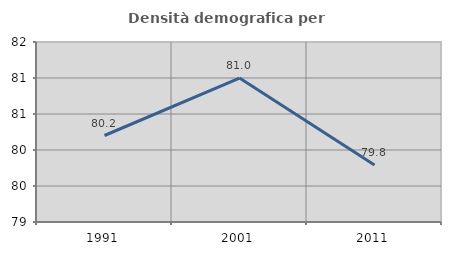
| Category | Densità demografica |
|---|---|
| 1991.0 | 80.201 |
| 2001.0 | 80.999 |
| 2011.0 | 79.791 |